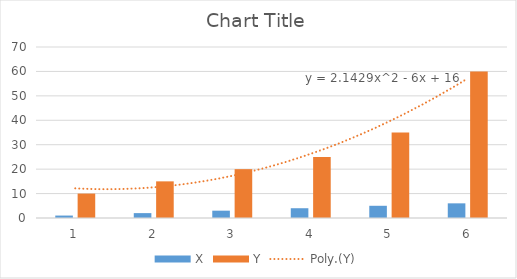
| Category | X | Y |
|---|---|---|
| 0 | 1 | 10 |
| 1 | 2 | 15 |
| 2 | 3 | 20 |
| 3 | 4 | 25 |
| 4 | 5 | 35 |
| 5 | 6 | 60 |